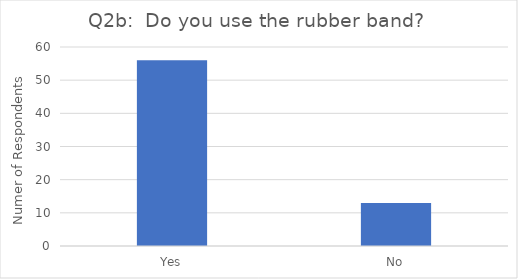
| Category | Series 0 |
|---|---|
| Yes | 56 |
| No | 13 |